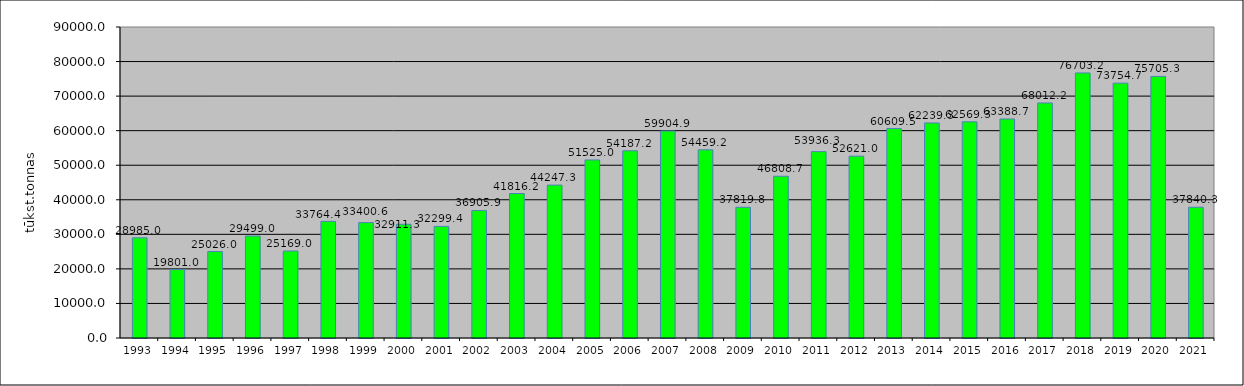
| Category | Series 0 |
|---|---|
| 1993.0 | 28985 |
| 1994.0 | 19801 |
| 1995.0 | 25026 |
| 1996.0 | 29499 |
| 1997.0 | 25169 |
| 1998.0 | 33764.4 |
| 1999.0 | 33400.6 |
| 2000.0 | 32911.3 |
| 2001.0 | 32299.4 |
| 2002.0 | 36905.9 |
| 2003.0 | 41816.2 |
| 2004.0 | 44247.3 |
| 2005.0 | 51525 |
| 2006.0 | 54187.2 |
| 2007.0 | 59904.9 |
| 2008.0 | 54459.2 |
| 2009.0 | 37819.8 |
| 2010.0 | 46808.7 |
| 2011.0 | 53936.3 |
| 2012.0 | 52621 |
| 2013.0 | 60609.5 |
| 2014.0 | 62239.3 |
| 2015.0 | 62569.3 |
| 2016.0 | 63388.7 |
| 2017.0 | 68012.2 |
| 2018.0 | 76703.2 |
| 2019.0 | 73754.7 |
| 2020.0 | 75705.3 |
| 2021.0 | 37840.3 |